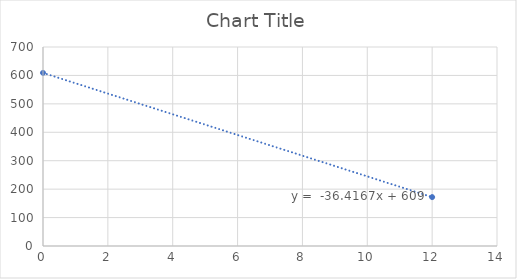
| Category | Series 0 |
|---|---|
| 0.0 | 609 |
| 12.0 | 172 |